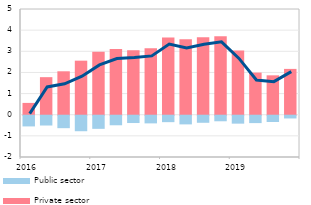
| Category | Private sector  | Public sector |
|---|---|---|
| 2016 | 0.559 | -0.507 |
| II | 1.776 | -0.463 |
| III | 2.053 | -0.589 |
| IV | 2.556 | -0.733 |
| 2017 | 2.977 | -0.621 |
| II | 3.109 | -0.452 |
| III | 3.055 | -0.347 |
| IV | 3.145 | -0.363 |
| 2018 | 3.649 | -0.305 |
| II | 3.567 | -0.411 |
| III | 3.668 | -0.334 |
| IV | 3.71 | -0.263 |
| 2019 | 3.039 | -0.375 |
| II | 1.992 | -0.349 |
| III | 1.862 | -0.298 |
| IV | 2.168 | -0.13 |